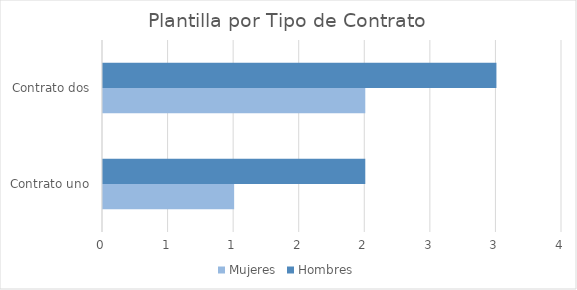
| Category | Mujeres | Hombres |
|---|---|---|
| Contrato uno | 1 | 2 |
| Contrato dos | 2 | 3 |